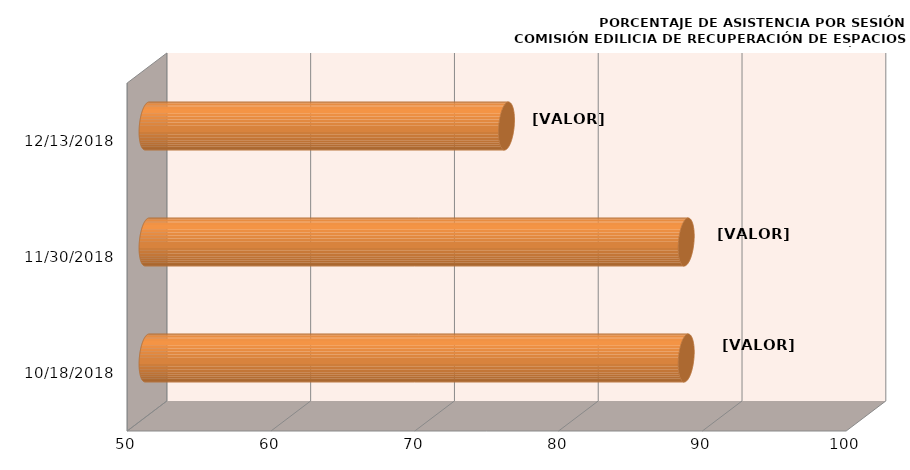
| Category | Series 0 |
|---|---|
| 10/18/18 | 87.5 |
| 11/30/18 | 87.5 |
| 12/13/18 | 75 |